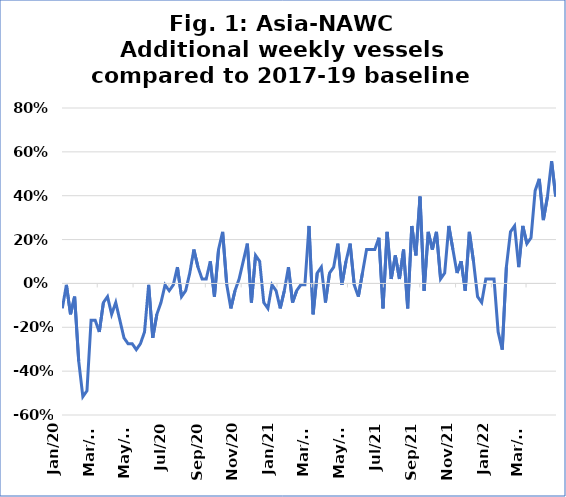
| Category | Asia-NAWC |
|---|---|
| 2020-01-06 | -0.114 |
| 2020-01-13 | -0.006 |
| 2020-01-20 | -0.141 |
| 2020-01-27 | -0.06 |
| 2020-02-03 | -0.356 |
| 2020-02-10 | -0.517 |
| 2020-02-17 | -0.49 |
| 2020-02-24 | -0.168 |
| 2020-03-02 | -0.168 |
| 2020-03-09 | -0.221 |
| 2020-03-16 | -0.087 |
| 2020-03-23 | -0.06 |
| 2020-03-30 | -0.141 |
| 2020-04-06 | -0.087 |
| 2020-04-13 | -0.168 |
| 2020-04-20 | -0.248 |
| 2020-04-27 | -0.275 |
| 2020-05-04 | -0.275 |
| 2020-05-11 | -0.302 |
| 2020-05-18 | -0.275 |
| 2020-05-25 | -0.221 |
| 2020-06-01 | -0.006 |
| 2020-06-08 | -0.248 |
| 2020-06-15 | -0.141 |
| 2020-06-22 | -0.087 |
| 2020-06-29 | -0.006 |
| 2020-07-06 | -0.033 |
| 2020-07-13 | -0.006 |
| 2020-07-20 | 0.074 |
| 2020-07-27 | -0.06 |
| 2020-08-03 | -0.033 |
| 2020-08-10 | 0.047 |
| 2020-08-17 | 0.155 |
| 2020-08-24 | 0.074 |
| 2020-08-31 | 0.02 |
| 2020-09-07 | 0.02 |
| 2020-09-14 | 0.101 |
| 2020-09-21 | -0.06 |
| 2020-09-28 | 0.155 |
| 2020-10-05 | 0.235 |
| 2020-10-12 | -0.006 |
| 2020-10-19 | -0.114 |
| 2020-10-26 | -0.033 |
| 2020-11-02 | 0.02 |
| 2020-11-09 | 0.101 |
| 2020-11-16 | 0.181 |
| 2020-11-23 | -0.087 |
| 2020-11-30 | 0.128 |
| 2020-12-07 | 0.101 |
| 2020-12-14 | -0.087 |
| 2020-12-21 | -0.114 |
| 2020-12-28 | -0.006 |
| 2021-01-04 | -0.033 |
| 2021-01-11 | -0.114 |
| 2021-01-18 | -0.033 |
| 2021-01-25 | 0.074 |
| 2021-02-01 | -0.087 |
| 2021-02-08 | -0.033 |
| 2021-02-15 | -0.006 |
| 2021-02-22 | -0.006 |
| 2021-03-01 | 0.262 |
| 2021-03-08 | -0.141 |
| 2021-03-15 | 0.047 |
| 2021-03-22 | 0.074 |
| 2021-03-29 | -0.087 |
| 2021-04-05 | 0.047 |
| 2021-04-12 | 0.074 |
| 2021-04-19 | 0.181 |
| 2021-04-26 | -0.006 |
| 2021-05-03 | 0.101 |
| 2021-05-10 | 0.181 |
| 2021-05-17 | -0.006 |
| 2021-05-24 | -0.06 |
| 2021-05-31 | 0.047 |
| 2021-06-07 | 0.155 |
| 2021-06-14 | 0.155 |
| 2021-06-21 | 0.155 |
| 2021-06-28 | 0.208 |
| 2021-07-05 | -0.114 |
| 2021-07-12 | 0.235 |
| 2021-07-19 | 0.02 |
| 2021-07-26 | 0.128 |
| 2021-08-02 | 0.02 |
| 2021-08-09 | 0.155 |
| 2021-08-16 | -0.114 |
| 2021-08-23 | 0.262 |
| 2021-08-30 | 0.128 |
| 2021-09-06 | 0.396 |
| 2021-09-13 | -0.033 |
| 2021-09-20 | 0.235 |
| 2021-09-27 | 0.155 |
| 2021-10-04 | 0.235 |
| 2021-10-11 | 0.02 |
| 2021-10-18 | 0.047 |
| 2021-10-25 | 0.262 |
| 2021-11-01 | 0.155 |
| 2021-11-08 | 0.047 |
| 2021-11-15 | 0.101 |
| 2021-11-22 | -0.033 |
| 2021-11-29 | 0.235 |
| 2021-12-06 | 0.101 |
| 2021-12-13 | -0.06 |
| 2021-12-20 | -0.087 |
| 2021-12-27 | 0.02 |
| 2022-01-03 | 0.02 |
| 2022-01-10 | 0.02 |
| 2022-01-17 | -0.221 |
| 2022-01-24 | -0.302 |
| 2022-01-31 | 0.074 |
| 2022-02-07 | 0.235 |
| 2022-02-14 | 0.262 |
| 2022-02-21 | 0.074 |
| 2022-02-28 | 0.262 |
| 2022-03-07 | 0.181 |
| 2022-03-14 | 0.208 |
| 2022-03-21 | 0.423 |
| 2022-03-28 | 0.477 |
| 2022-04-04 | 0.289 |
| 2022-04-11 | 0.396 |
| 2022-04-18 | 0.557 |
| 2022-04-25 | 0.396 |